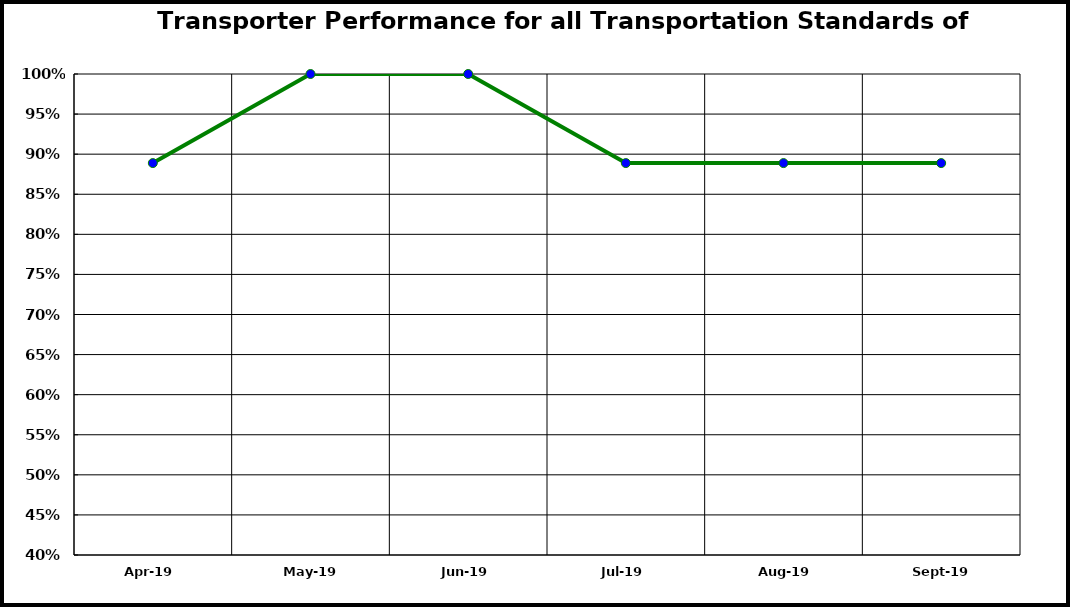
| Category | Performance |
|---|---|
| 2019-04-01 | 0.889 |
| 2019-05-01 | 1 |
| 2019-06-01 | 1 |
| 2019-07-01 | 0.889 |
| 2019-08-01 | 0.889 |
| 2019-09-01 | 0.889 |